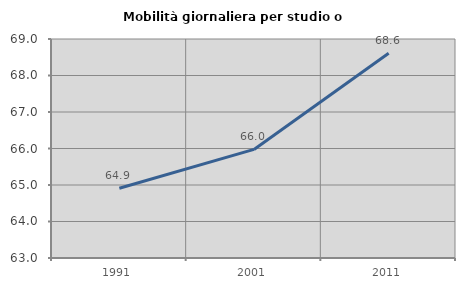
| Category | Mobilità giornaliera per studio o lavoro |
|---|---|
| 1991.0 | 64.912 |
| 2001.0 | 65.975 |
| 2011.0 | 68.61 |